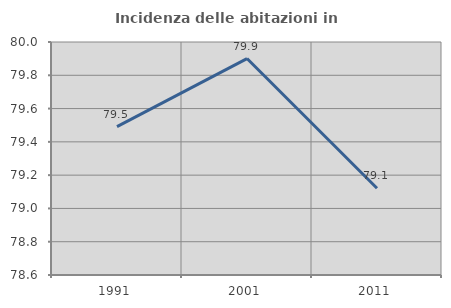
| Category | Incidenza delle abitazioni in proprietà  |
|---|---|
| 1991.0 | 79.491 |
| 2001.0 | 79.901 |
| 2011.0 | 79.122 |